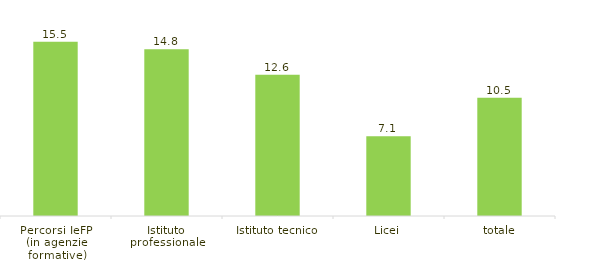
| Category | 2022/23 |
|---|---|
| Percorsi IeFP 
(in agenzie formative) | 15.53 |
| Istituto professionale | 14.848 |
| Istituto tecnico | 12.588 |
| Licei | 7.108 |
| totale | 10.546 |